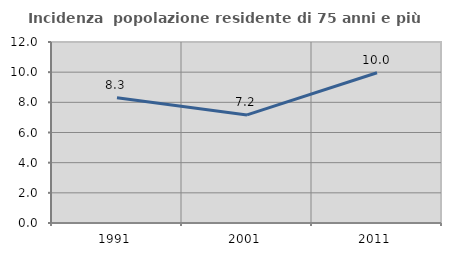
| Category | Incidenza  popolazione residente di 75 anni e più |
|---|---|
| 1991.0 | 8.297 |
| 2001.0 | 7.167 |
| 2011.0 | 9.96 |